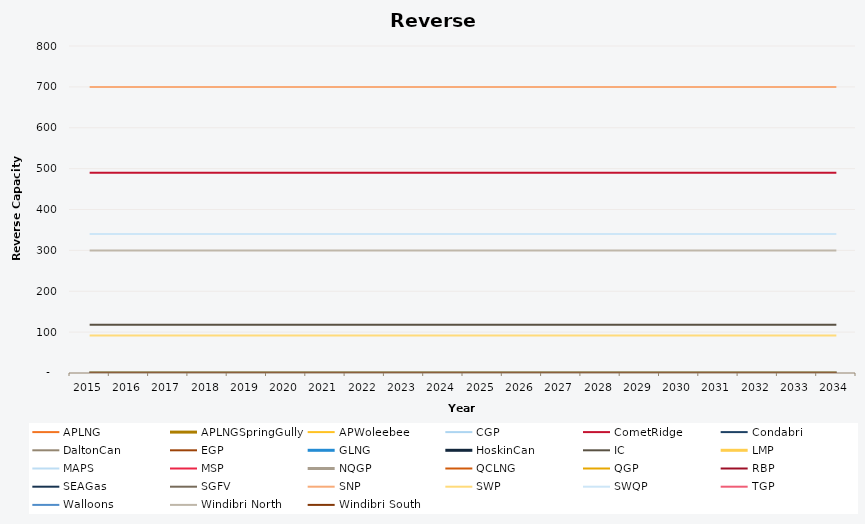
| Category | APLNG | APLNGSpringGully | APWoleebee | CGP | CometRidge | Condabri | DaltonCan | EGP | GLNG | HoskinCan | IC | LMP | MAPS | MSP | NQGP | QCLNG | QGP | RBP | SEAGas | SGFV | SNP | SWP | SWQP | TGP | Walloons | Windibri North | Windibri South |
|---|---|---|---|---|---|---|---|---|---|---|---|---|---|---|---|---|---|---|---|---|---|---|---|---|---|---|---|
| 2015.0 | 0 | 0 | 0 | 0 | 490 | 0 | 0 | 0 | 0 | 0 | 118 | 0 | 0 | 0 | 0 | 0 | 0 | 0 | 0 | 0 | 700 | 92 | 340 | 0 | 0 | 300 | 0 |
| 2016.0 | 0 | 0 | 0 | 0 | 490 | 0 | 0 | 0 | 0 | 0 | 118 | 0 | 0 | 0 | 0 | 0 | 0 | 0 | 0 | 0 | 700 | 92 | 340 | 0 | 0 | 300 | 0 |
| 2017.0 | 0 | 0 | 0 | 0 | 490 | 0 | 0 | 0 | 0 | 0 | 118 | 0 | 0 | 0 | 0 | 0 | 0 | 0 | 0 | 0 | 700 | 92 | 340 | 0 | 0 | 300 | 0 |
| 2018.0 | 0 | 0 | 0 | 0 | 490 | 0 | 0 | 0 | 0 | 0 | 118 | 0 | 0 | 0 | 0 | 0 | 0 | 0 | 0 | 0 | 700 | 92 | 340 | 0 | 0 | 300 | 0 |
| 2019.0 | 0 | 0 | 0 | 0 | 490 | 0 | 0 | 0 | 0 | 0 | 118 | 0 | 0 | 0 | 0 | 0 | 0 | 0 | 0 | 0 | 700 | 92 | 340 | 0 | 0 | 300 | 0 |
| 2020.0 | 0 | 0 | 0 | 0 | 490 | 0 | 0 | 0 | 0 | 0 | 118 | 0 | 0 | 0 | 0 | 0 | 0 | 0 | 0 | 0 | 700 | 92 | 340 | 0 | 0 | 300 | 0 |
| 2021.0 | 0 | 0 | 0 | 0 | 490 | 0 | 0 | 0 | 0 | 0 | 118 | 0 | 0 | 0 | 0 | 0 | 0 | 0 | 0 | 0 | 700 | 92 | 340 | 0 | 0 | 300 | 0 |
| 2022.0 | 0 | 0 | 0 | 0 | 490 | 0 | 0 | 0 | 0 | 0 | 118 | 0 | 0 | 0 | 0 | 0 | 0 | 0 | 0 | 0 | 700 | 92 | 340 | 0 | 0 | 300 | 0 |
| 2023.0 | 0 | 0 | 0 | 0 | 490 | 0 | 0 | 0 | 0 | 0 | 118 | 0 | 0 | 0 | 0 | 0 | 0 | 0 | 0 | 0 | 700 | 92 | 340 | 0 | 0 | 300 | 0 |
| 2024.0 | 0 | 0 | 0 | 0 | 490 | 0 | 0 | 0 | 0 | 0 | 118 | 0 | 0 | 0 | 0 | 0 | 0 | 0 | 0 | 0 | 700 | 92 | 340 | 0 | 0 | 300 | 0 |
| 2025.0 | 0 | 0 | 0 | 0 | 490 | 0 | 0 | 0 | 0 | 0 | 118 | 0 | 0 | 0 | 0 | 0 | 0 | 0 | 0 | 0 | 700 | 92 | 340 | 0 | 0 | 300 | 0 |
| 2026.0 | 0 | 0 | 0 | 0 | 490 | 0 | 0 | 0 | 0 | 0 | 118 | 0 | 0 | 0 | 0 | 0 | 0 | 0 | 0 | 0 | 700 | 92 | 340 | 0 | 0 | 300 | 0 |
| 2027.0 | 0 | 0 | 0 | 0 | 490 | 0 | 0 | 0 | 0 | 0 | 118 | 0 | 0 | 0 | 0 | 0 | 0 | 0 | 0 | 0 | 700 | 92 | 340 | 0 | 0 | 300 | 0 |
| 2028.0 | 0 | 0 | 0 | 0 | 490 | 0 | 0 | 0 | 0 | 0 | 118 | 0 | 0 | 0 | 0 | 0 | 0 | 0 | 0 | 0 | 700 | 92 | 340 | 0 | 0 | 300 | 0 |
| 2029.0 | 0 | 0 | 0 | 0 | 490 | 0 | 0 | 0 | 0 | 0 | 118 | 0 | 0 | 0 | 0 | 0 | 0 | 0 | 0 | 0 | 700 | 92 | 340 | 0 | 0 | 300 | 0 |
| 2030.0 | 0 | 0 | 0 | 0 | 490 | 0 | 0 | 0 | 0 | 0 | 118 | 0 | 0 | 0 | 0 | 0 | 0 | 0 | 0 | 0 | 700 | 92 | 340 | 0 | 0 | 300 | 0 |
| 2031.0 | 0 | 0 | 0 | 0 | 490 | 0 | 0 | 0 | 0 | 0 | 118 | 0 | 0 | 0 | 0 | 0 | 0 | 0 | 0 | 0 | 700 | 92 | 340 | 0 | 0 | 300 | 0 |
| 2032.0 | 0 | 0 | 0 | 0 | 490 | 0 | 0 | 0 | 0 | 0 | 118 | 0 | 0 | 0 | 0 | 0 | 0 | 0 | 0 | 0 | 700 | 92 | 340 | 0 | 0 | 300 | 0 |
| 2033.0 | 0 | 0 | 0 | 0 | 490 | 0 | 0 | 0 | 0 | 0 | 118 | 0 | 0 | 0 | 0 | 0 | 0 | 0 | 0 | 0 | 700 | 92 | 340 | 0 | 0 | 300 | 0 |
| 2034.0 | 0 | 0 | 0 | 0 | 490 | 0 | 0 | 0 | 0 | 0 | 118 | 0 | 0 | 0 | 0 | 0 | 0 | 0 | 0 | 0 | 700 | 92 | 340 | 0 | 0 | 300 | 0 |